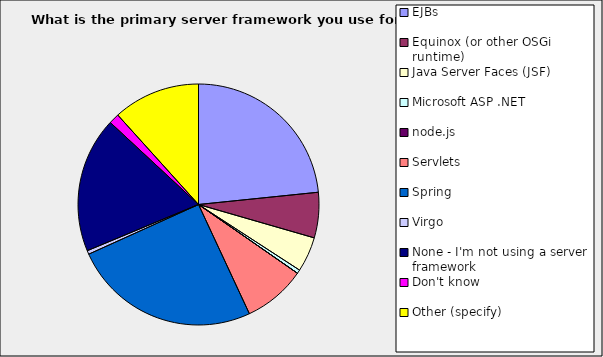
| Category | Series 0 |
|---|---|
| EJBs | 0.234 |
| Equinox (or other OSGi runtime) | 0.061 |
| Java Server Faces (JSF) | 0.047 |
| Microsoft ASP .NET | 0.005 |
| node.js | 0 |
| Servlets | 0.084 |
| Spring | 0.252 |
| Virgo | 0.005 |
| None - I'm not using a server framework | 0.182 |
| Don't know | 0.014 |
| Other (specify) | 0.117 |